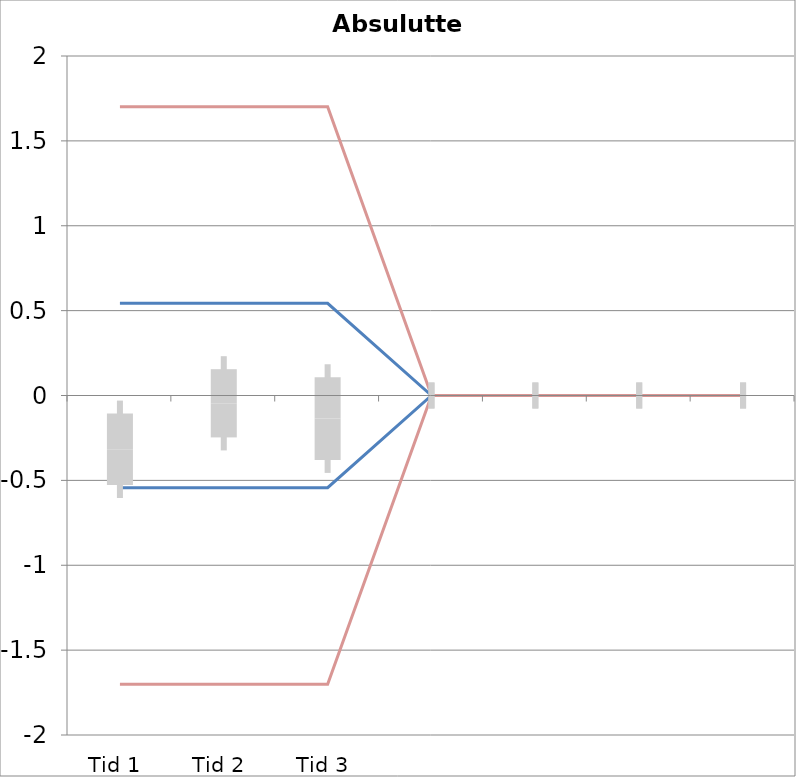
| Category | 1 | 2 | 3 | 4 | 5 | 6 | 7 | 8 | 9 | 10 | 11 | 12 | 13 | 14 | 15 | 16 | 17 | 18 | 19 | 20 | TEa | B | -B | -TEa | M |
|---|---|---|---|---|---|---|---|---|---|---|---|---|---|---|---|---|---|---|---|---|---|---|---|---|---|
| Tid 1 | -0.11 | -0.08 | -0.79 | -0.59 | -0.33 | -0.01 | -0.56 | -0.6 | -0.1 | 0 | 0 | 0 | 0 | 0 | 0 | 0 | 0 | 0 | 0 | 0 | 1.701 | 0.543 | -0.543 | -1.701 | -0.317 |
| Tid 2 | -0.37 | -0.09 | -0.4 | -0.16 | -0.24 | 0.13 | 0.36 | -0.2 | 0.14 | 0.37 | 0 | 0 | 0 | 0 | 0 | 0 | 0 | 0 | 0 | 0 | 1.701 | 0.543 | -0.543 | -1.701 | -0.046 |
| Tid 3 | -0.67 | 0.01 | -0.7 | -0.06 | -0.24 | 0.03 | 0.46 | -0.1 | -0.06 | -0.03 | 0 | 0 | 0 | 0 | 0 | 0 | 0 | 0 | 0 | 0 | 1.701 | 0.543 | -0.543 | -1.701 | -0.136 |